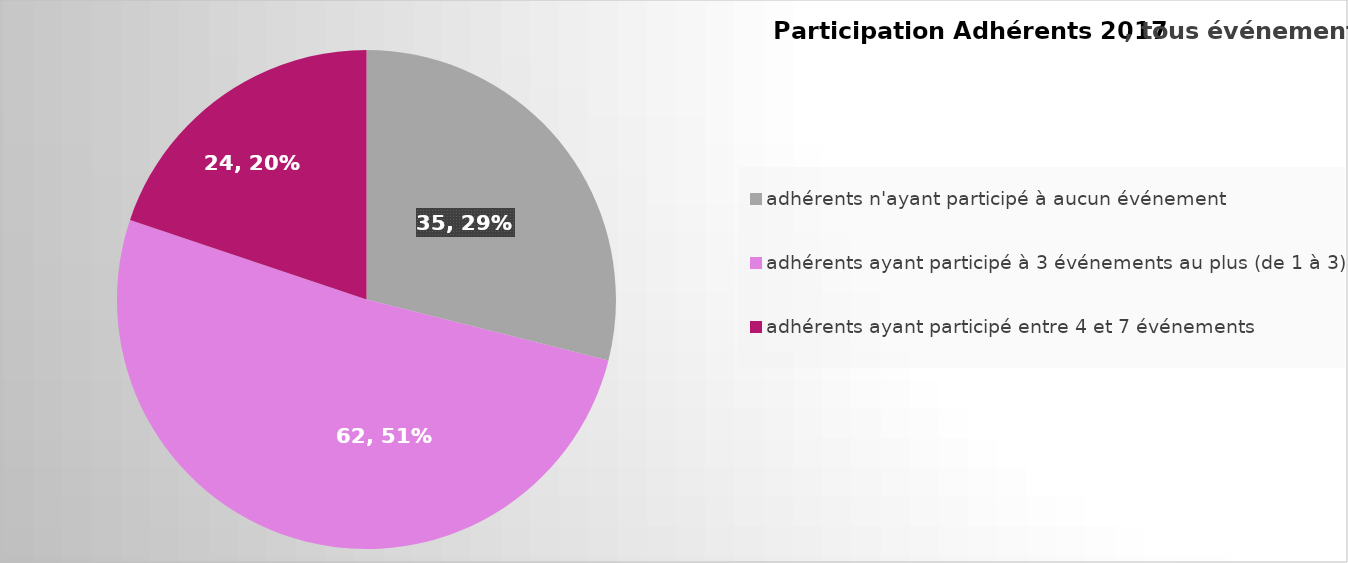
| Category | Series 0 |
|---|---|
| adhérents n'ayant participé à aucun événement | 35 |
| adhérents ayant participé à 3 événements au plus (de 1 à 3) | 62 |
| adhérents ayant participé entre 4 et 7 événements  | 24 |